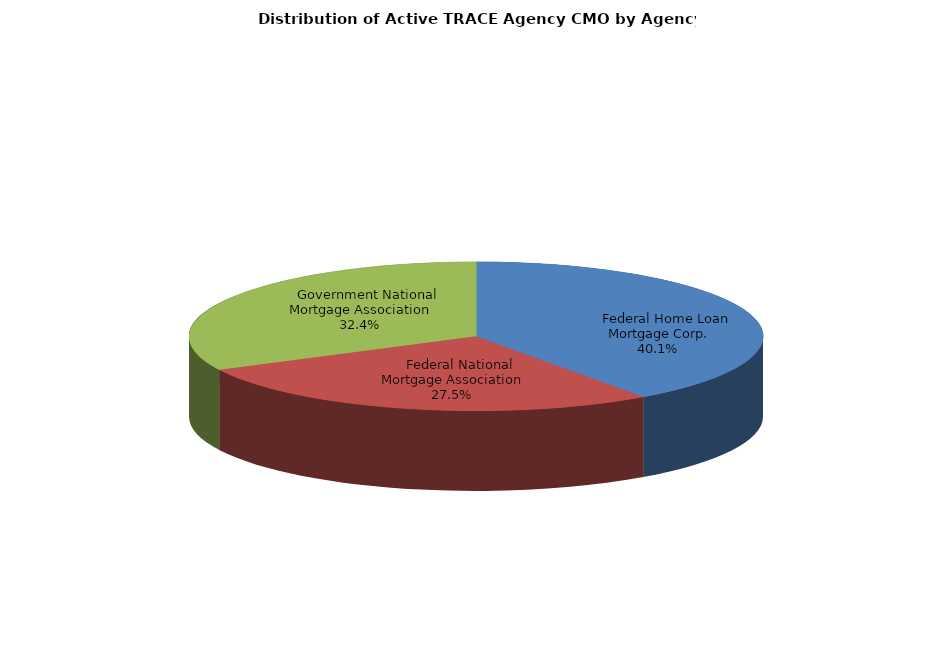
| Category | Series 0 |
|---|---|
|     Federal Home Loan Mortgage Corp. | 75218 |
|     Federal National Mortgage Association | 51508 |
|     Government National Mortgage Association | 60844 |